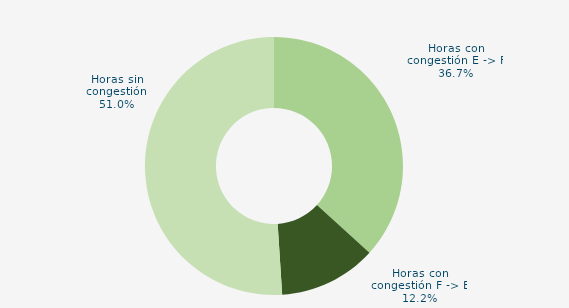
| Category | Horas con congestión E -> F |
|---|---|
| Horas con congestión E -> F | 36.743 |
| Horas con congestión F -> E | 12.248 |
| Horas sin congestión | 51.009 |